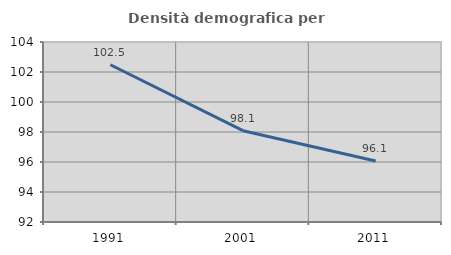
| Category | Densità demografica |
|---|---|
| 1991.0 | 102.483 |
| 2001.0 | 98.088 |
| 2011.0 | 96.067 |